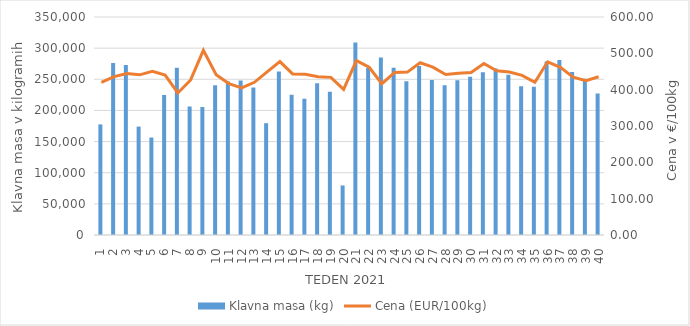
| Category | Klavna masa (kg) |
|---|---|
| 1.0 | 177573 |
| 2.0 | 275951 |
| 3.0 | 272797 |
| 4.0 | 174056 |
| 5.0 | 156508 |
| 6.0 | 224595 |
| 7.0 | 268436 |
| 8.0 | 206193 |
| 9.0 | 205669 |
| 10.0 | 240592 |
| 11.0 | 246325 |
| 12.0 | 248020 |
| 13.0 | 236703 |
| 14.0 | 179478 |
| 15.0 | 262544 |
| 16.0 | 225033 |
| 17.0 | 218950 |
| 18.0 | 243711 |
| 19.0 | 229955 |
| 20.0 | 79521 |
| 21.0 | 309134 |
| 22.0 | 268074 |
| 23.0 | 285151 |
| 24.0 | 268579 |
| 25.0 | 246944 |
| 26.0 | 271319 |
| 27.0 | 248858 |
| 28.0 | 240609 |
| 29.0 | 248383 |
| 30.0 | 253894 |
| 31.0 | 261374 |
| 32.0 | 267142 |
| 33.0 | 257352 |
| 34.0 | 239018 |
| 35.0 | 238034 |
| 36.0 | 278443 |
| 37.0 | 280772 |
| 38.0 | 261791 |
| 39.0 | 250972 |
| 40.0 | 226992 |